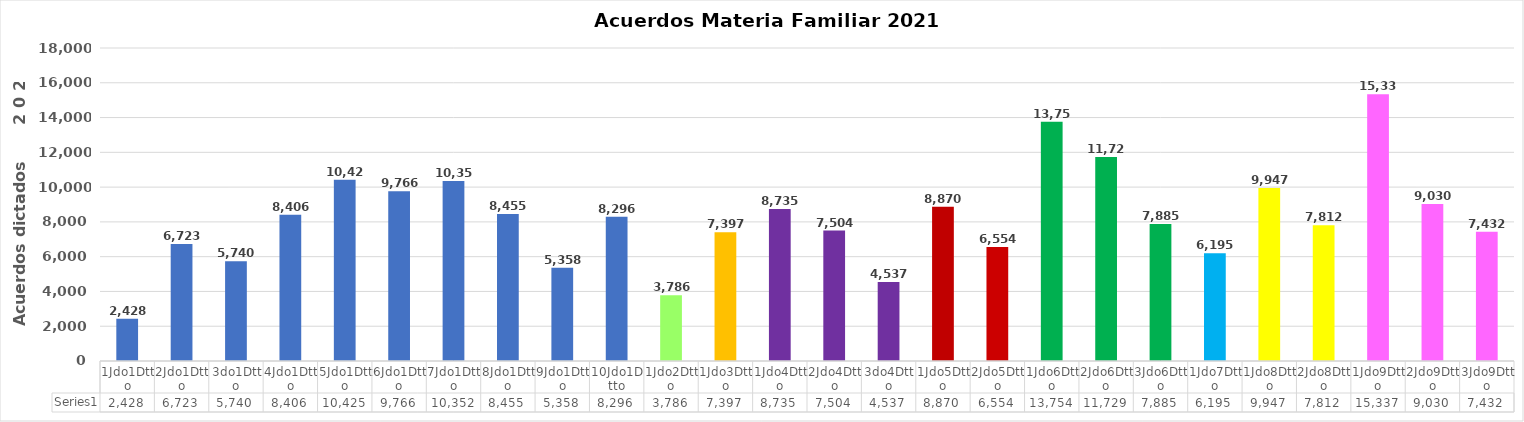
| Category | Series 0 |
|---|---|
| 1Jdo1Dtto | 2428 |
| 2Jdo1Dtto | 6723 |
| 3do1Dtto | 5740 |
| 4Jdo1Dtto | 8406 |
| 5Jdo1Dtto | 10425 |
| 6Jdo1Dtto | 9766 |
| 7Jdo1Dtto | 10352 |
| 8Jdo1Dtto | 8455 |
| 9Jdo1Dtto | 5358 |
| 10Jdo1Dtto | 8296 |
| 1Jdo2Dtto | 3786 |
| 1Jdo3Dtto | 7397 |
| 1Jdo4Dtto | 8735 |
| 2Jdo4Dtto | 7504 |
| 3do4Dtto | 4537 |
| 1Jdo5Dtto | 8870 |
| 2Jdo5Dtto | 6554 |
| 1Jdo6Dtto | 13754 |
| 2Jdo6Dtto | 11729 |
| 3Jdo6Dtto | 7885 |
| 1Jdo7Dtto | 6195 |
| 1Jdo8Dtto | 9947 |
| 2Jdo8Dtto | 7812 |
| 1Jdo9Dtto | 15337 |
| 2Jdo9Dtto | 9030 |
| 3Jdo9Dtto | 7432 |